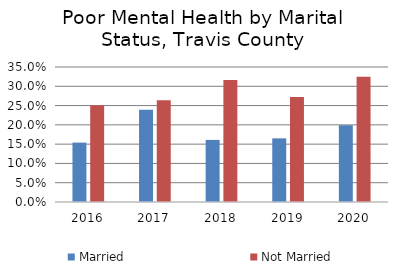
| Category | Married | Not Married |
|---|---|---|
| 2016.0 | 0.154 | 0.251 |
| 2017.0 | 0.239 | 0.264 |
| 2018.0 | 0.161 | 0.316 |
| 2019.0 | 0.165 | 0.272 |
| 2020.0 | 0.199 | 0.325 |